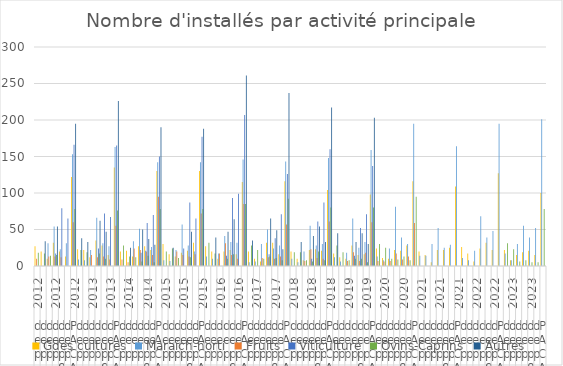
| Category | Gdes cultures | Maraîch-horti | Fruits | Viticulture | Ovins-Caprins | Autres |
|---|---|---|---|---|---|---|
| 0 | 27 | 0 | 10 | 0 | 18 | 0 |
| 1 | 20 | 0 | 0 | 0 | 17 | 34 |
| 2 | 10 | 31 | 13 | 0 | 14 | 0 |
| 3 | 32 | 54 | 13 | 17 | 15 | 54 |
| 4 | 20 | 23 | 12 | 79 | 0 | 0 |
| 5 | 13 | 31 | 0 | 65 | 0 | 0 |
| 6 | 122 | 153 | 60 | 166 | 78 | 195 |
| 7 | 23 | 9 | 0 | 0 | 22 | 38 |
| 8 | 22 | 8 | 0 | 0 | 19 | 33 |
| 9 | 12 | 22 | 15 | 0 | 0 | 0 |
| 10 | 35 | 66 | 12 | 24 | 17 | 62 |
| 11 | 28 | 31 | 13 | 72 | 10 | 47 |
| 12 | 15 | 27 | 9 | 67 | 0 | 0 |
| 13 | 135 | 163 | 55 | 165 | 76 | 226 |
| 14 | 20 | 0 | 9 | 0 | 28 | 0 |
| 15 | 21 | 0 | 5 | 0 | 13 | 25 |
| 16 | 13 | 34 | 24 | 0 | 12 | 0 |
| 17 | 27 | 51 | 22 | 18 | 6 | 50 |
| 18 | 27 | 21 | 20 | 59 | 14 | 37 |
| 19 | 22 | 26 | 15 | 70 | 5 | 29 |
| 20 | 130 | 142 | 95 | 150 | 78 | 190 |
| 21 | 30 | 8 | 0 | 0 | 20 | 0 |
| 22 | 16 | 7 | 0 | 0 | 24 | 25 |
| 23 | 13 | 22 | 20 | 0 | 11 | 0 |
| 24 | 18 | 57 | 15 | 24 | 0 | 0 |
| 25 | 21 | 28 | 13 | 87 | 12 | 47 |
| 26 | 32 | 20 | 16 | 65 | 0 | 0 |
| 27 | 130 | 142 | 72 | 177 | 78 | 188 |
| 28 | 27 | 13 | 0 | 0 | 32 | 0 |
| 29 | 20 | 10 | 0 | 0 | 17 | 39 |
| 30 | 10 | 17 | 17 | 0 | 0 | 0 |
| 31 | 20 | 41 | 31 | 14 | 10 | 47 |
| 32 | 22 | 33 | 15 | 93 | 16 | 64 |
| 33 | 16 | 32 | 10 | 99 | 0 | 0 |
| 34 | 115 | 146 | 85 | 207 | 85 | 261 |
| 35 | 20 | 5 | 0 | 0 | 28 | 35 |
| 36 | 10 | 6 | 0 | 0 | 22 | 0 |
| 37 | 6 | 30 | 11 | 0 | 10 | 0 |
| 38 | 32 | 50 | 12 | 16 | 13 | 65 |
| 39 | 32 | 24 | 10 | 38 | 11 | 49 |
| 40 | 16 | 28 | 13 | 71 | 8 | 23 |
| 41 | 116 | 143 | 57 | 126 | 92 | 237 |
| 42 | 20 | 10 | 0 | 0 | 19 | 0 |
| 43 | 10 | 5 | 0 | 0 | 19 | 33 |
| 44 | 8 | 20 | 7 | 0 | 8 | 0 |
| 45 | 22 | 55 | 23 | 10 | 6 | 41 |
| 46 | 23 | 28 | 11 | 61 | 20 | 54 |
| 47 | 21 | 30 | 10 | 87 | 8 | 33 |
| 48 | 104 | 148 | 61 | 160 | 80 | 217 |
| 49 | 17 | 12 | 0 | 0 | 28 | 45 |
| 50 | 12 | 6 | 0 | 0 | 19 | 0 |
| 51 | 10 | 18 | 7 | 0 | 8 | 0 |
| 52 | 28 | 65 | 19 | 14 | 10 | 33 |
| 53 | 15 | 25 | 7 | 52 | 10 | 45 |
| 54 | 16 | 33 | 18 | 71 | 5 | 30 |
| 55 | 98 | 159 | 60 | 137 | 80 | 203 |
| 56 | 24 | 13 | 7 | 0 | 30 | 0 |
| 57 | 11 | 8 | 6 | 0 | 25 | 0 |
| 58 | 10 | 24 | 7 | 0 | 10 | 0 |
| 59 | 22 | 81 | 17 | 0 | 9 | 0 |
| 60 | 21 | 39 | 9 | 0 | 13 | 0 |
| 61 | 28 | 30 | 13 | 0 | 8 | 0 |
| 62 | 116 | 195 | 59 | 0 | 95 | 0 |
| 63 | 20 | 14 | 0 | 0 | 0 | 0 |
| 64 | 15 | 14 | 0 | 0 | 0 | 0 |
| 65 | 5 | 30 | 0 | 0 | 0 | 0 |
| 66 | 22 | 52 | 0 | 0 | 0 | 0 |
| 67 | 22 | 25 | 0 | 0 | 0 | 0 |
| 68 | 25 | 29 | 0 | 0 | 0 | 0 |
| 69 | 109 | 164 | 0 | 0 | 0 | 0 |
| 70 | 26 | 11 | 0 | 0 | 0 | 0 |
| 71 | 17 | 8 | 0 | 0 | 0 | 0 |
| 72 | 6 | 21 | 0 | 0 | 0 | 0 |
| 73 | 24 | 68 | 0 | 0 | 0 | 0 |
| 74 | 32 | 39 | 0 | 0 | 0 | 0 |
| 75 | 22 | 48 | 0 | 0 | 0 | 0 |
| 76 | 127 | 195 | 0 | 0 | 0 | 0 |
| 77 | 22 | 17 | 0 | 0 | 31 | 0 |
| 78 | 8 | 8 | 0 | 0 | 23 | 0 |
| 79 | 15 | 30 | 0 | 0 | 6 | 0 |
| 80 | 19 | 55 | 0 | 0 | 8 | 0 |
| 81 | 21 | 39 | 0 | 0 | 5 | 0 |
| 82 | 15 | 52 | 0 | 0 | 5 | 0 |
| 83 | 100 | 201 | 0 | 0 | 78 | 0 |